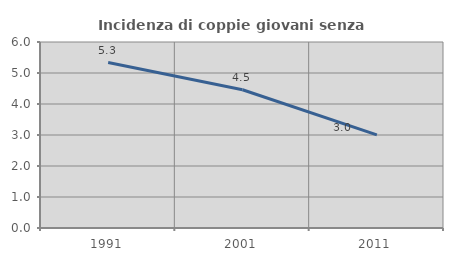
| Category | Incidenza di coppie giovani senza figli |
|---|---|
| 1991.0 | 5.336 |
| 2001.0 | 4.459 |
| 2011.0 | 3.004 |